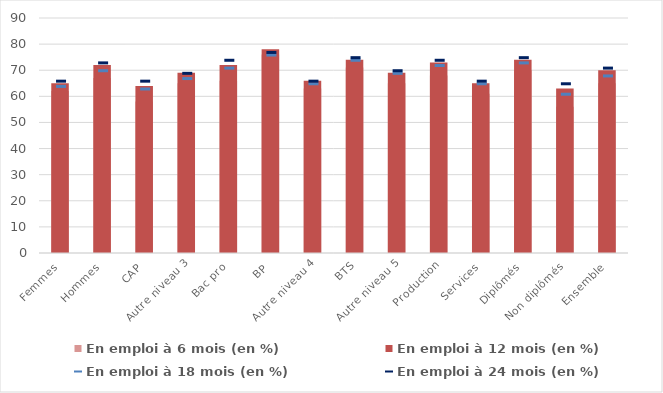
| Category | En emploi à 6 mois (en %) | En emploi à 12 mois (en %) |
|---|---|---|
| Femmes | 62 | 65 |
| Hommes | 67 | 72 |
| CAP | 58 | 64 |
| Autre niveau 3 | 65 | 69 |
| Bac pro | 66 | 72 |
| BP | 76 | 78 |
| Autre niveau 4 | 63 | 66 |
| BTS | 71 | 74 |
| Autre niveau 5 | 65 | 69 |
| Production | 68 | 73 |
| Services | 61 | 65 |
| Diplômés | 70 | 74 |
| Non diplômés | 56 | 63 |
| Ensemble | 65 | 70 |